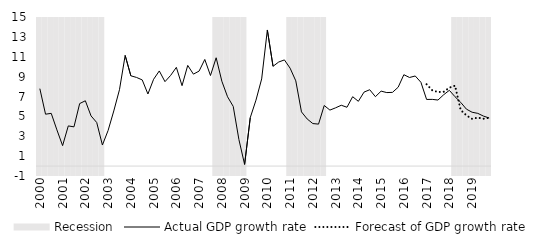
| Category | Recession |
|---|---|
| 2000.0 | 1 |
| 2000.0 | 1 |
| 2000.0 | 1 |
| 2000.0 | 1 |
| 2001.0 | 1 |
| 2001.0 | 1 |
| 2001.0 | 1 |
| 2001.0 | 1 |
| 2002.0 | 1 |
| 2002.0 | 1 |
| 2002.0 | 1 |
| 2002.0 | 1 |
| 2003.0 | 0 |
| 2003.0 | 0 |
| 2003.0 | 0 |
| 2003.0 | 0 |
| 2004.0 | 0 |
| 2004.0 | 0 |
| 2004.0 | 0 |
| 2004.0 | 0 |
| 2005.0 | 0 |
| 2005.0 | 0 |
| 2005.0 | 0 |
| 2005.0 | 0 |
| 2006.0 | 0 |
| 2006.0 | 0 |
| 2006.0 | 0 |
| 2006.0 | 0 |
| 2007.0 | 0 |
| 2007.0 | 0 |
| 2007.0 | 0 |
| 2007.0 | 1 |
| 2008.0 | 1 |
| 2008.0 | 1 |
| 2008.0 | 1 |
| 2008.0 | 1 |
| 2009.0 | 1 |
| 2009.0 | 0 |
| 2009.0 | 0 |
| 2009.0 | 0 |
| 2010.0 | 0 |
| 2010.0 | 0 |
| 2010.0 | 0 |
| 2010.0 | 0 |
| 2011.0 | 1 |
| 2011.0 | 1 |
| 2011.0 | 1 |
| 2011.0 | 1 |
| 2012.0 | 1 |
| 2012.0 | 1 |
| 2012.0 | 1 |
| 2012.0 | 0 |
| 2013.0 | 0 |
| 2013.0 | 0 |
| 2013.0 | 0 |
| 2013.0 | 0 |
| 2014.0 | 0 |
| 2014.0 | 0 |
| 2014.0 | 0 |
| 2014.0 | 0 |
| 2015.0 | 0 |
| 2015.0 | 0 |
| 2015.0 | 0 |
| 2015.0 | 0 |
| 2016.0 | 0 |
| 2016.0 | 0 |
| 2016.0 | 0 |
| 2016.0 | 0 |
| 2017.0 | 0 |
| 2017.0 | 0 |
| 2017.0 | 0 |
| 2017.0 | 0 |
| 2018.0 | 0 |
| 2018.0 | 1 |
| 2018.0 | 1 |
| 2018.0 | 1 |
| 2019.0 | 1 |
| 2019.0 | 1 |
| 2019.0 | 1 |
| 2019.0 | 1 |